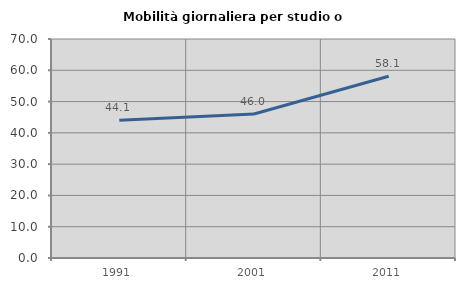
| Category | Mobilità giornaliera per studio o lavoro |
|---|---|
| 1991.0 | 44.053 |
| 2001.0 | 46.04 |
| 2011.0 | 58.084 |